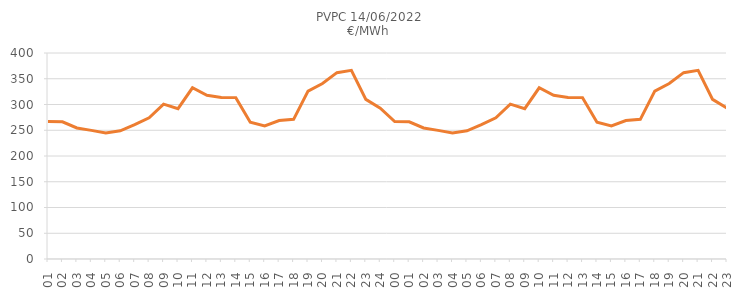
| Category | PVPC 14/06/2022
€/MWh |
|---|---|
| 2001-01-01 | 266.95 |
| 2002-01-01 | 266.34 |
| 2003-01-01 | 254.41 |
| 2004-01-01 | 249.73 |
| 2005-01-01 | 244.74 |
| 2006-01-01 | 248.96 |
| 2007-01-01 | 261.12 |
| 2008-01-01 | 274.29 |
| 2009-01-01 | 300.68 |
| 2010-01-01 | 291.95 |
| 2011-01-01 | 332.44 |
| 2012-01-01 | 317.75 |
| 2013-01-01 | 313.79 |
| 2014-01-01 | 313.36 |
| 2015-01-01 | 265.42 |
| 2016-01-01 | 258.4 |
| 2017-01-01 | 268.77 |
| 2018-01-01 | 271.23 |
| 2019-01-01 | 325.92 |
| 2020-01-01 | 340.65 |
| 2021-01-01 | 361.8 |
| 2022-01-01 | 366.25 |
| 2023-01-01 | 309.93 |
| 2024-01-01 | 292.87 |
| 2000-01-01 | 266.95 |
| 2001-01-01 | 266.34 |
| 2002-01-01 | 254.41 |
| 2003-01-01 | 249.73 |
| 2004-01-01 | 244.74 |
| 2005-01-01 | 248.96 |
| 2006-01-01 | 261.12 |
| 2007-01-01 | 274.29 |
| 2008-01-01 | 300.68 |
| 2009-01-01 | 291.95 |
| 2010-01-01 | 332.44 |
| 2011-01-01 | 317.75 |
| 2012-01-01 | 313.79 |
| 2013-01-01 | 313.36 |
| 2014-01-01 | 265.42 |
| 2015-01-01 | 258.4 |
| 2016-01-01 | 268.77 |
| 2017-01-01 | 271.23 |
| 2018-01-01 | 325.92 |
| 2019-01-01 | 340.65 |
| 2020-01-01 | 361.8 |
| 2021-01-01 | 366.25 |
| 2022-01-01 | 309.93 |
| 2023-01-01 | 292.87 |